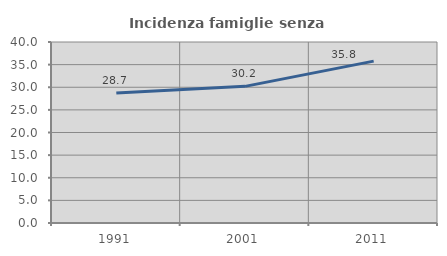
| Category | Incidenza famiglie senza nuclei |
|---|---|
| 1991.0 | 28.733 |
| 2001.0 | 30.197 |
| 2011.0 | 35.775 |